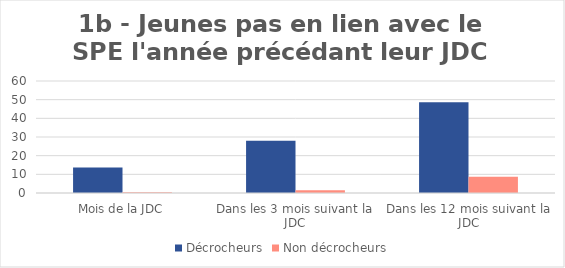
| Category | Décrocheurs | Non décrocheurs |
|---|---|---|
| Mois de la JDC | 13.625 | 0.363 |
| Dans les 3 mois suivant la JDC | 27.949 | 1.526 |
| Dans les 12 mois suivant la JDC | 48.632 | 8.733 |